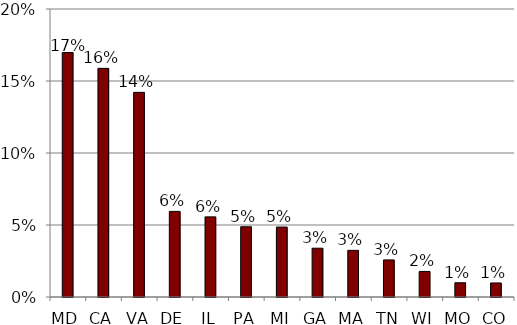
| Category | Series 0 |
|---|---|
| MD | 0.17 |
| CA | 0.159 |
| VA | 0.142 |
| DE | 0.059 |
| IL | 0.056 |
| PA | 0.049 |
| MI | 0.049 |
| GA | 0.034 |
| MA | 0.032 |
| TN | 0.026 |
| WI | 0.018 |
| MO | 0.01 |
| CO | 0.01 |